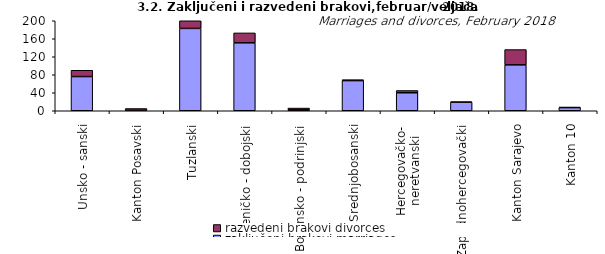
| Category | zaključeni brakovi marriages | razvedeni brakovi divorces |
|---|---|---|
| Unsko - sanski | 76 | 14 |
| Kanton Posavski | 1 | 4 |
| Tuzlanski | 183 | 29 |
| Zeničko - dobojski | 151 | 22 |
| Bosansko - podrinjski | 2 | 4 |
| Srednjobosanski | 67 | 2 |
| Hercegovačko-
neretvanski | 40 | 5 |
| Zapadnohercegovački | 19 | 1 |
| Kanton Sarajevo | 102 | 34 |
| Kanton 10 | 7 | 1 |